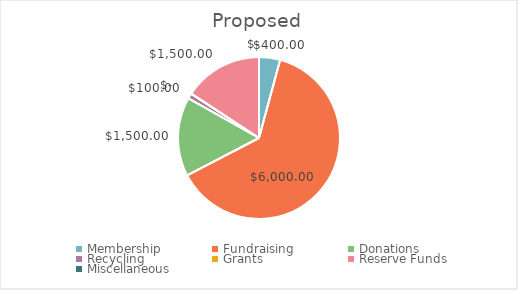
| Category | Proposed |
|---|---|
| Membership | 400 |
| Fundraising | 6000 |
| Donations | 1500 |
| Recycling | 100 |
| Grants | 0 |
| Reserve Funds | 1500 |
| Miscellaneous | 0 |